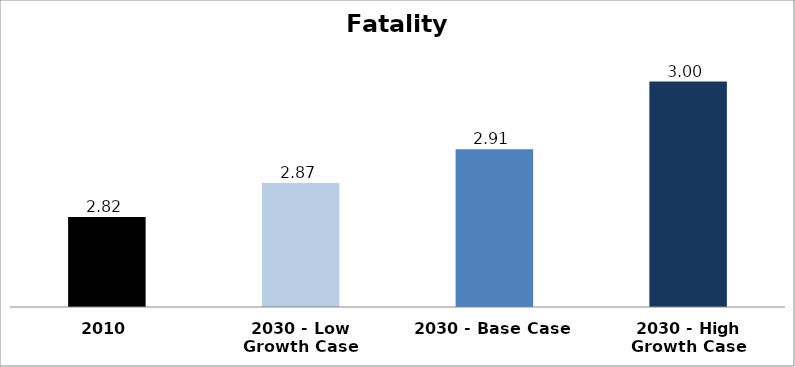
| Category | Fatality Rate |
|---|---|
| 2010 | 2.821 |
| 2030 - Low Growth Case | 2.866 |
| 2030 - Base Case | 2.912 |
| 2030 - High Growth Case | 3.002 |